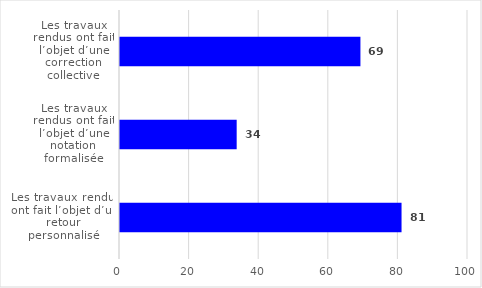
| Category | Series 0 |
|---|---|
| Les travaux rendus ont fait l’objet d’une correction collective | 69.089 |
| Les travaux rendus ont fait l’objet d’une notation formalisée | 33.528 |
| Les travaux rendus ont fait l’objet d’un retour personnalisé | 80.903 |